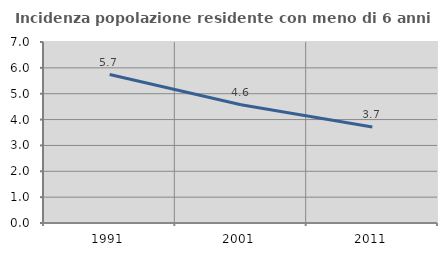
| Category | Incidenza popolazione residente con meno di 6 anni |
|---|---|
| 1991.0 | 5.741 |
| 2001.0 | 4.571 |
| 2011.0 | 3.716 |